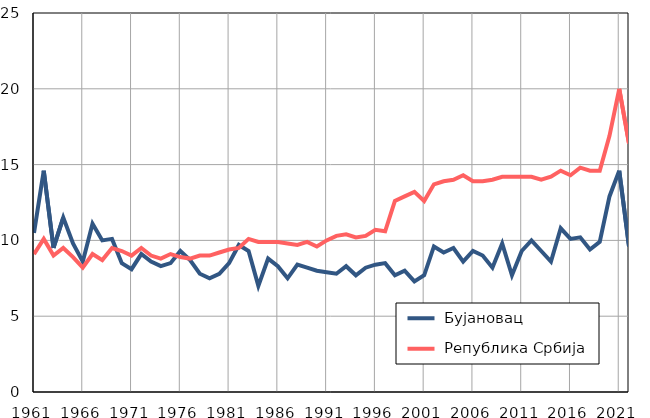
| Category |  Бујановац |  Република Србија |
|---|---|---|
| 1961.0 | 10.5 | 9.1 |
| 1962.0 | 14.6 | 10.1 |
| 1963.0 | 9.5 | 9 |
| 1964.0 | 11.5 | 9.5 |
| 1965.0 | 9.8 | 8.9 |
| 1966.0 | 8.6 | 8.2 |
| 1967.0 | 11.1 | 9.1 |
| 1968.0 | 10 | 8.7 |
| 1969.0 | 10.1 | 9.5 |
| 1970.0 | 8.5 | 9.3 |
| 1971.0 | 8.1 | 9 |
| 1972.0 | 9.1 | 9.5 |
| 1973.0 | 8.6 | 9 |
| 1974.0 | 8.3 | 8.8 |
| 1975.0 | 8.5 | 9.1 |
| 1976.0 | 9.3 | 8.9 |
| 1977.0 | 8.7 | 8.8 |
| 1978.0 | 7.8 | 9 |
| 1979.0 | 7.5 | 9 |
| 1980.0 | 7.8 | 9.2 |
| 1981.0 | 8.5 | 9.4 |
| 1982.0 | 9.7 | 9.5 |
| 1983.0 | 9.3 | 10.1 |
| 1984.0 | 7 | 9.9 |
| 1985.0 | 8.8 | 9.9 |
| 1986.0 | 8.3 | 9.9 |
| 1987.0 | 7.5 | 9.8 |
| 1988.0 | 8.4 | 9.7 |
| 1989.0 | 8.2 | 9.9 |
| 1990.0 | 8 | 9.6 |
| 1991.0 | 7.9 | 10 |
| 1992.0 | 7.8 | 10.3 |
| 1993.0 | 8.3 | 10.4 |
| 1994.0 | 7.7 | 10.2 |
| 1995.0 | 8.2 | 10.3 |
| 1996.0 | 8.4 | 10.7 |
| 1997.0 | 8.5 | 10.6 |
| 1998.0 | 7.7 | 12.6 |
| 1999.0 | 8 | 12.9 |
| 2000.0 | 7.3 | 13.2 |
| 2001.0 | 7.7 | 12.6 |
| 2002.0 | 9.6 | 13.7 |
| 2003.0 | 9.2 | 13.9 |
| 2004.0 | 9.5 | 14 |
| 2005.0 | 8.6 | 14.3 |
| 2006.0 | 9.3 | 13.9 |
| 2007.0 | 9 | 13.9 |
| 2008.0 | 8.2 | 14 |
| 2009.0 | 9.8 | 14.2 |
| 2010.0 | 7.7 | 14.2 |
| 2011.0 | 9.3 | 14.2 |
| 2012.0 | 10 | 14.2 |
| 2013.0 | 9.3 | 14 |
| 2014.0 | 8.6 | 14.2 |
| 2015.0 | 10.8 | 14.6 |
| 2016.0 | 10.1 | 14.3 |
| 2017.0 | 10.2 | 14.8 |
| 2018.0 | 9.4 | 14.6 |
| 2019.0 | 9.9 | 14.6 |
| 2020.0 | 12.9 | 16.9 |
| 2021.0 | 14.6 | 20 |
| 2022.0 | 9.6 | 16.4 |